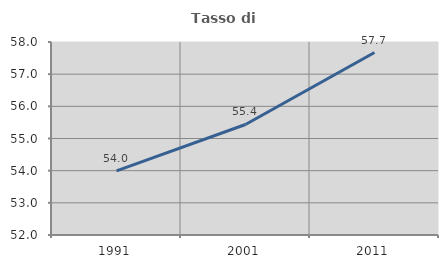
| Category | Tasso di occupazione   |
|---|---|
| 1991.0 | 53.995 |
| 2001.0 | 55.436 |
| 2011.0 | 57.672 |